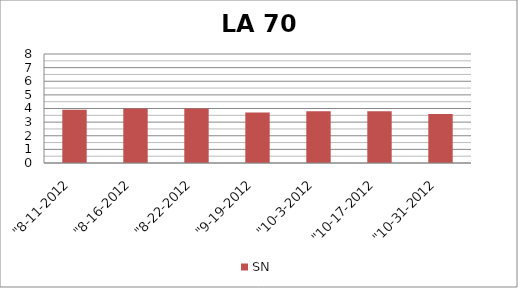
| Category | SN |
|---|---|
| "8-11-2012 | 3.9 |
| "8-16-2012 | 4 |
| "8-22-2012 | 4 |
| "9-19-2012 | 3.7 |
| "10-3-2012 | 3.8 |
| "10-17-2012 | 3.8 |
| "10-31-2012 | 3.6 |